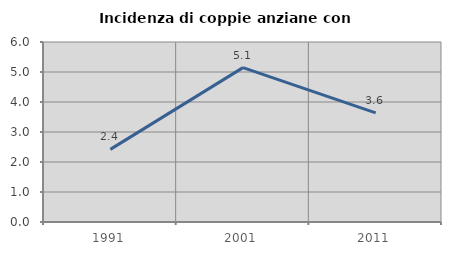
| Category | Incidenza di coppie anziane con figli |
|---|---|
| 1991.0 | 2.42 |
| 2001.0 | 5.146 |
| 2011.0 | 3.639 |